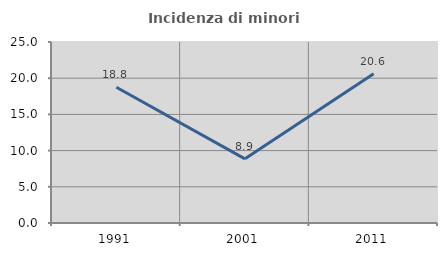
| Category | Incidenza di minori stranieri |
|---|---|
| 1991.0 | 18.75 |
| 2001.0 | 8.861 |
| 2011.0 | 20.628 |